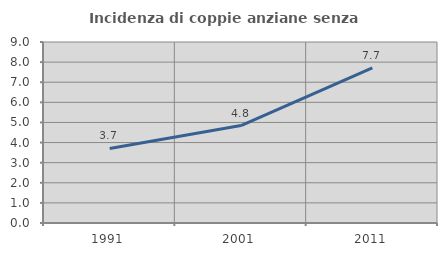
| Category | Incidenza di coppie anziane senza figli  |
|---|---|
| 1991.0 | 3.708 |
| 2001.0 | 4.846 |
| 2011.0 | 7.709 |